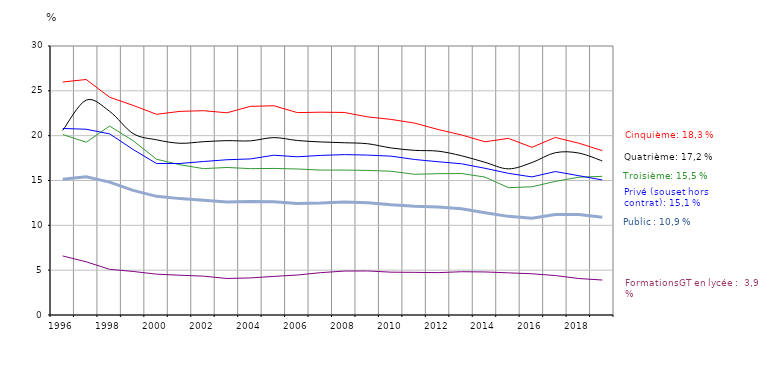
| Category | 5ème | 4ème | 3ème | Formations GT en lycée | Privé (sous et hors contrat) | Public |
|---|---|---|---|---|---|---|
| 1996.0 | 25.985 | 20.584 | 20.129 | 6.585 | 20.804 | 15.141 |
| 1997.0 | 26.264 | 23.964 | 19.267 | 5.933 | 20.717 | 15.419 |
| 1998.0 | 24.289 | 22.71 | 21.071 | 5.092 | 20.199 | 14.816 |
| 1999.0 | 23.376 | 20.237 | 19.439 | 4.857 | 18.458 | 13.896 |
| 2000.0 | 22.384 | 19.538 | 17.371 | 4.553 | 16.892 | 13.231 |
| 2001.0 | 22.71 | 19.151 | 16.753 | 4.436 | 16.899 | 12.979 |
| 2002.0 | 22.785 | 19.326 | 16.323 | 4.333 | 17.119 | 12.795 |
| 2003.0 | 22.552 | 19.444 | 16.453 | 4.074 | 17.316 | 12.589 |
| 2004.0 | 23.269 | 19.422 | 16.323 | 4.134 | 17.408 | 12.662 |
| 2005.0 | 23.335 | 19.785 | 16.345 | 4.306 | 17.818 | 12.639 |
| 2006.0 | 22.57 | 19.462 | 16.285 | 4.46 | 17.644 | 12.424 |
| 2007.0 | 22.619 | 19.3 | 16.164 | 4.722 | 17.797 | 12.489 |
| 2008.0 | 22.589 | 19.211 | 16.162 | 4.899 | 17.886 | 12.615 |
| 2009.0 | 22.092 | 19.099 | 16.125 | 4.911 | 17.835 | 12.524 |
| 2010.0 | 21.813 | 18.629 | 16.028 | 4.775 | 17.714 | 12.293 |
| 2011.0 | 21.402 | 18.363 | 15.692 | 4.757 | 17.344 | 12.123 |
| 2012.0 | 20.688 | 18.273 | 15.759 | 4.724 | 17.092 | 12.033 |
| 2013.0 | 20.081 | 17.76 | 15.778 | 4.826 | 16.865 | 11.846 |
| 2014.0 | 19.318 | 17.027 | 15.382 | 4.802 | 16.361 | 11.4 |
| 2015.0 | 19.7 | 16.3 | 14.2 | 4.7 | 15.8 | 11 |
| 2016.0 | 18.7 | 17 | 14.3 | 4.6 | 15.4 | 10.8 |
| 2017.0 | 19.8 | 18.1 | 14.9 | 4.4 | 16 | 11.2 |
| 2018.0 | 19.159 | 18.062 | 15.37 | 4.068 | 15.537 | 11.209 |
| 2019.0 | 18.329 | 17.179 | 15.464 | 3.9 | 15.06 | 10.9 |